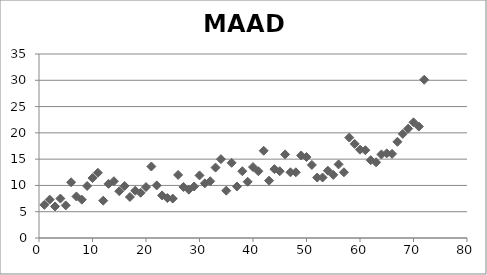
| Category | MAAD |
|---|---|
| 1.0 | 6.3 |
| 2.0 | 7.3 |
| 3.0 | 6 |
| 4.0 | 7.5 |
| 5.0 | 6.2 |
| 6.0 | 10.6 |
| 7.0 | 7.9 |
| 8.0 | 7.3 |
| 9.0 | 9.9 |
| 10.0 | 11.4 |
| 11.0 | 12.4 |
| 12.0 | 7.1 |
| 13.0 | 10.3 |
| 14.0 | 10.8 |
| 15.0 | 8.9 |
| 16.0 | 9.9 |
| 17.0 | 7.8 |
| 18.0 | 9 |
| 19.0 | 8.6 |
| 20.0 | 9.7 |
| 21.0 | 13.6 |
| 22.0 | 10 |
| 23.0 | 8.1 |
| 24.0 | 7.6 |
| 25.0 | 7.5 |
| 26.0 | 12 |
| 27.0 | 9.7 |
| 28.0 | 9.2 |
| 29.0 | 9.8 |
| 30.0 | 11.9 |
| 31.0 | 10.4 |
| 32.0 | 10.8 |
| 33.0 | 13.4 |
| 34.0 | 15 |
| 35.0 | 9 |
| 36.0 | 14.3 |
| 37.0 | 9.8 |
| 38.0 | 12.7 |
| 39.0 | 10.7 |
| 40.0 | 13.5 |
| 41.0 | 12.7 |
| 42.0 | 16.6 |
| 43.0 | 10.9 |
| 44.0 | 13.1 |
| 45.0 | 12.7 |
| 46.0 | 15.9 |
| 47.0 | 12.5 |
| 48.0 | 12.5 |
| 49.0 | 15.7 |
| 50.0 | 15.4 |
| 51.0 | 13.9 |
| 52.0 | 11.5 |
| 53.0 | 11.5 |
| 54.0 | 12.8 |
| 55.0 | 12 |
| 56.0 | 14 |
| 57.0 | 12.5 |
| 58.0 | 19.1 |
| 59.0 | 17.9 |
| 60.0 | 16.8 |
| 61.0 | 16.7 |
| 62.0 | 14.8 |
| 63.0 | 14.4 |
| 64.0 | 15.9 |
| 65.0 | 16.1 |
| 66.0 | 16 |
| 67.0 | 18.3 |
| 68.0 | 19.8 |
| 69.0 | 20.8 |
| 70.0 | 22 |
| 71.0 | 21.2 |
| 72.0 | 30.1 |